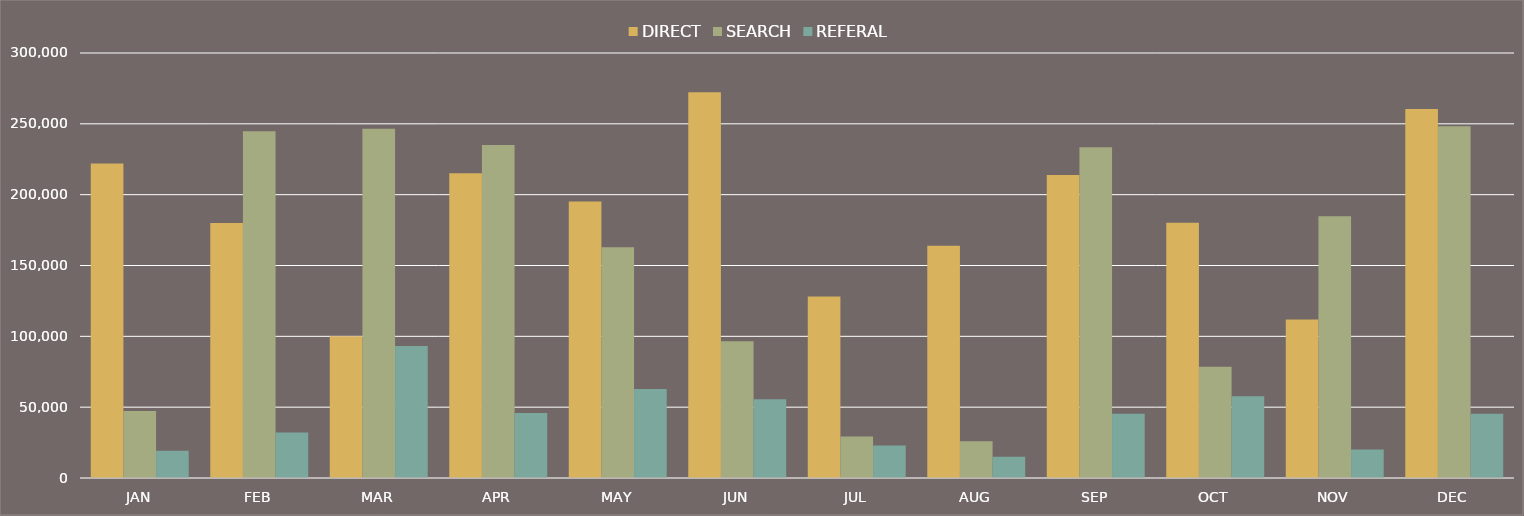
| Category | DIRECT | SEARCH | REFERAL |
|---|---|---|---|
| JAN | 222006 | 47216 | 19193 |
| FEB | 180009 | 244714 | 32086 |
| MAR | 99998 | 246549 | 93117 |
| APR | 215030 | 235062 | 45862 |
| MAY | 195262 | 162881 | 62853 |
| JUN | 272260 | 96528 | 55513 |
| JUL | 128123 | 29235 | 22945 |
| AUG | 163950 | 25934 | 15084 |
| SEP | 213914 | 233397 | 45347 |
| OCT | 180191 | 78479 | 57736 |
| NOV | 111890 | 184799 | 20142 |
| DEC | 260495 | 248215 | 45284 |